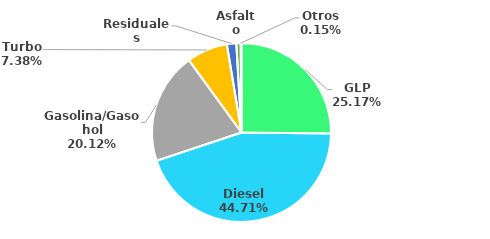
| Category | MBPD |
|---|---|
| GLP | 62.069 |
| Diesel | 110.262 |
| Gasolina/Gasohol | 49.615 |
| Turbo | 18.195 |
| Residuales | 4.199 |
| Asfalto | 1.924 |
| Otros | 0.359 |